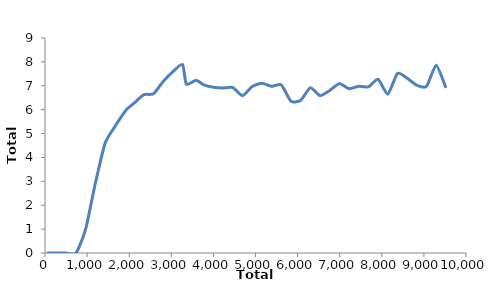
| Category | Breakthrough Eu |
|---|---|
| 46.0 | -0.003 |
| 276.0 | -0.004 |
| 506.0 | -0.004 |
| 736.0 | -0.004 |
| 966.0 | 1.004 |
| 1196.0 | 2.918 |
| 1426.0 | 4.587 |
| 1656.0 | 5.283 |
| 1932.0 | 5.996 |
| 2116.0 | 6.271 |
| 2346.0 | 6.627 |
| 2576.0 | 6.662 |
| 2806.0 | 7.177 |
| 3036.0 | 7.587 |
| 3266.0 | 7.89 |
| 3358.0 | 7.066 |
| 3588.0 | 7.23 |
| 3772.0 | 7.039 |
| 4002.0 | 6.937 |
| 4232.0 | 6.906 |
| 4462.0 | 6.927 |
| 4692.0 | 6.587 |
| 4922.0 | 6.969 |
| 5152.0 | 7.106 |
| 5382.0 | 6.978 |
| 5612.0 | 7.04 |
| 5842.0 | 6.352 |
| 6072.0 | 6.388 |
| 6302.0 | 6.917 |
| 6532.0 | 6.588 |
| 6762.0 | 6.803 |
| 6992.0 | 7.089 |
| 7222.0 | 6.878 |
| 7452.0 | 6.98 |
| 7682.0 | 6.956 |
| 7912.0 | 7.27 |
| 8142.0 | 6.648 |
| 8372.0 | 7.517 |
| 8602.0 | 7.316 |
| 8832.0 | 7.02 |
| 9062.0 | 6.975 |
| 9292.0 | 7.862 |
| 9522.0 | 6.911 |